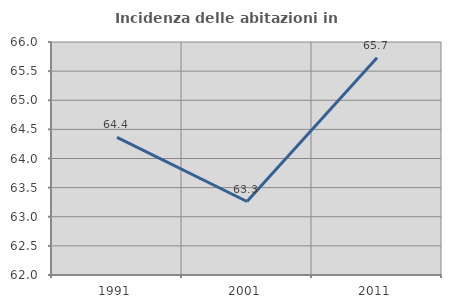
| Category | Incidenza delle abitazioni in proprietà  |
|---|---|
| 1991.0 | 64.362 |
| 2001.0 | 63.262 |
| 2011.0 | 65.731 |